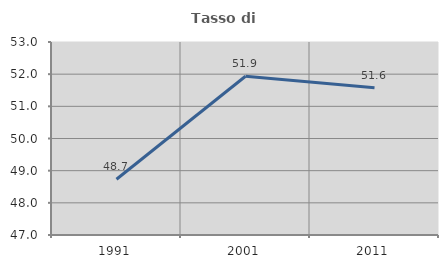
| Category | Tasso di occupazione   |
|---|---|
| 1991.0 | 48.734 |
| 2001.0 | 51.934 |
| 2011.0 | 51.577 |